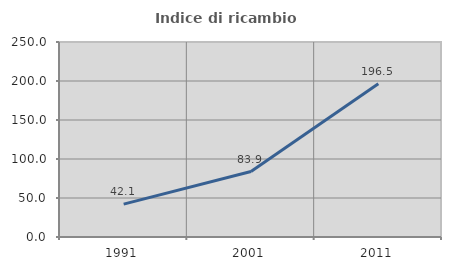
| Category | Indice di ricambio occupazionale  |
|---|---|
| 1991.0 | 42.09 |
| 2001.0 | 83.904 |
| 2011.0 | 196.498 |